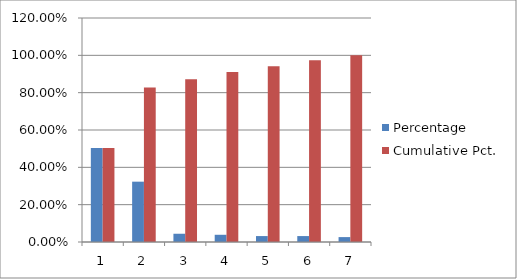
| Category | Percentage | Cumulative Pct. |
|---|---|---|
| 0 | 0.504 | 0.504 |
| 1 | 0.323 | 0.827 |
| 2 | 0.044 | 0.872 |
| 3 | 0.039 | 0.91 |
| 4 | 0.032 | 0.942 |
| 5 | 0.032 | 0.974 |
| 6 | 0.026 | 1 |